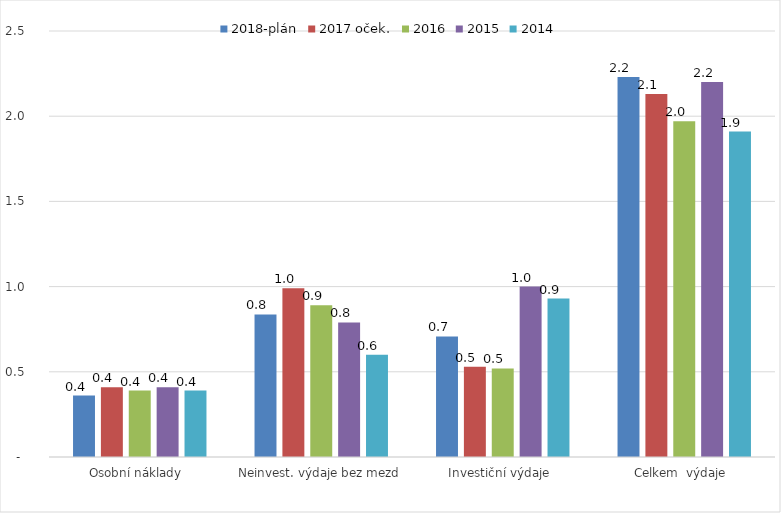
| Category | 2018-plán | 2017 oček. | 2016 | 2015 | 2014 |
|---|---|---|---|---|---|
| Osobní náklady  | 0.361 | 0.41 | 0.39 | 0.41 | 0.39 |
| Neinvest. výdaje bez mezd | 0.837 | 0.99 | 0.89 | 0.79 | 0.6 |
| Investiční výdaje  | 0.708 | 0.53 | 0.52 | 1 | 0.93 |
| Celkem  výdaje  | 2.23 | 2.13 | 1.97 | 2.2 | 1.91 |